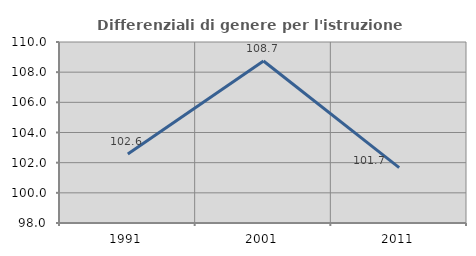
| Category | Differenziali di genere per l'istruzione superiore |
|---|---|
| 1991.0 | 102.573 |
| 2001.0 | 108.74 |
| 2011.0 | 101.674 |